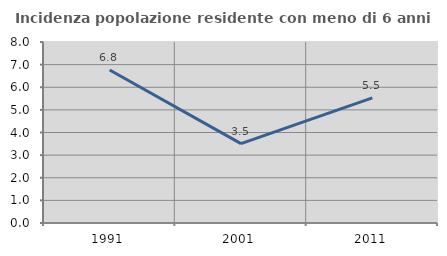
| Category | Incidenza popolazione residente con meno di 6 anni |
|---|---|
| 1991.0 | 6.763 |
| 2001.0 | 3.51 |
| 2011.0 | 5.53 |